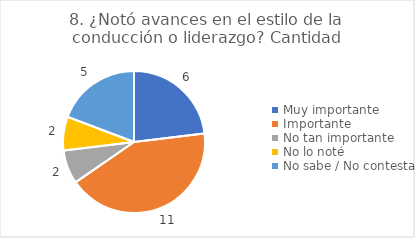
| Category | 8. ¿Notó avances en el estilo de la conducción o liderazgo? |
|---|---|
| Muy importante  | 0.231 |
| Importante  | 0.423 |
| No tan importante  | 0.077 |
| No lo noté  | 0.077 |
| No sabe / No contesta | 0.192 |